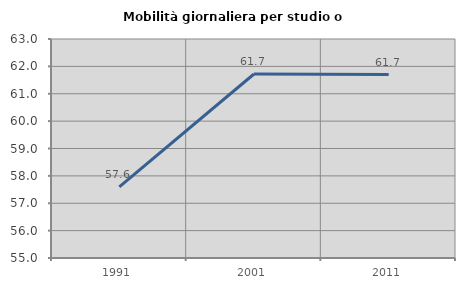
| Category | Mobilità giornaliera per studio o lavoro |
|---|---|
| 1991.0 | 57.601 |
| 2001.0 | 61.722 |
| 2011.0 | 61.702 |